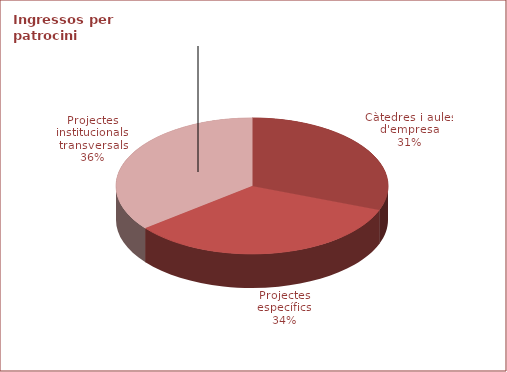
| Category | Series 0 |
|---|---|
| Càtedres i aules d'empresa | 1934700 |
| Projectes específics | 2113762 |
| Projectes institucionals transversals | 2245000 |